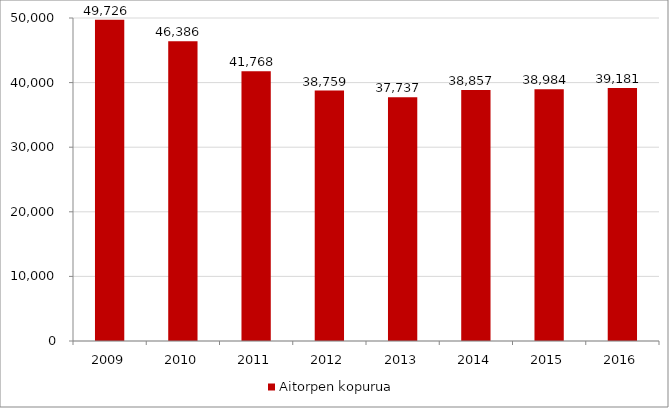
| Category | Aitorpen kopurua |
|---|---|
| 2009.0 | 49726 |
| 2010.0 | 46386 |
| 2011.0 | 41768 |
| 2012.0 | 38759 |
| 2013.0 | 37737 |
| 2014.0 | 38857 |
| 2015.0 | 38984 |
| 2016.0 | 39181 |